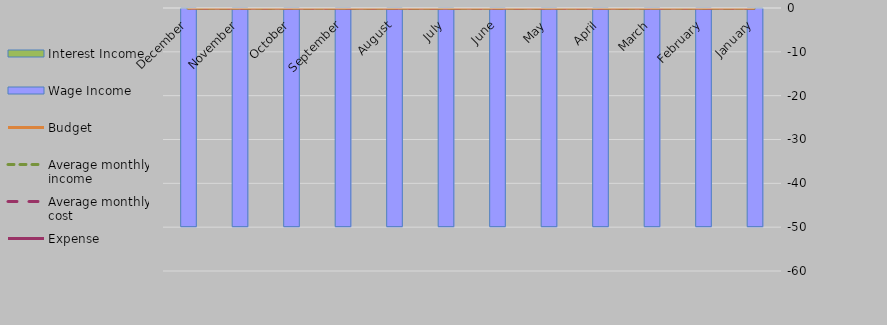
| Category | Wage Income | Interest Income |
|---|---|---|
| January | -50 | 0 |
| February | -50 | 0 |
| March | -50 | 0 |
| April | -50 | 0 |
| May | -50 | 0 |
| June | -50 | 0 |
| July | -50 | 0 |
| August | -50 | 0 |
| September | -50 | 0 |
| October | -50 | 0 |
| November | -50 | 0 |
| December | -50 | 0 |